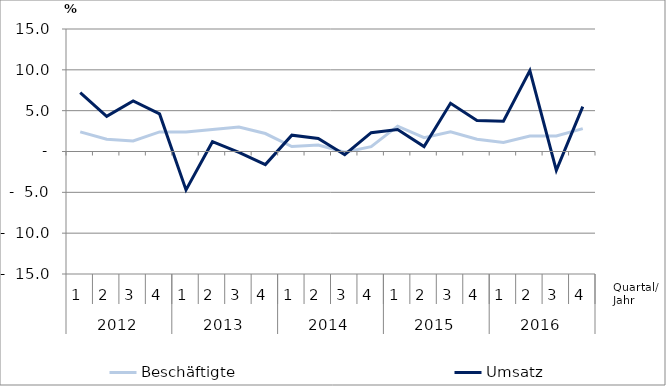
| Category | Beschäftigte | Umsatz |
|---|---|---|
| 0 | 2.4 | 7.2 |
| 1 | 1.5 | 4.3 |
| 2 | 1.3 | 6.2 |
| 3 | 2.4 | 4.6 |
| 4 | 2.4 | -4.7 |
| 5 | 2.7 | 1.2 |
| 6 | 3 | -0.1 |
| 7 | 2.2 | -1.6 |
| 8 | 0.6 | 2 |
| 9 | 0.8 | 1.6 |
| 10 | -0.1 | -0.4 |
| 11 | 0.6 | 2.3 |
| 12 | 3.1 | 2.7 |
| 13 | 1.7 | 0.6 |
| 14 | 2.4 | 5.9 |
| 15 | 1.5 | 3.8 |
| 16 | 1.1 | 3.7 |
| 17 | 1.9 | 9.9 |
| 18 | 1.9 | -2.3 |
| 19 | 2.8 | 5.5 |